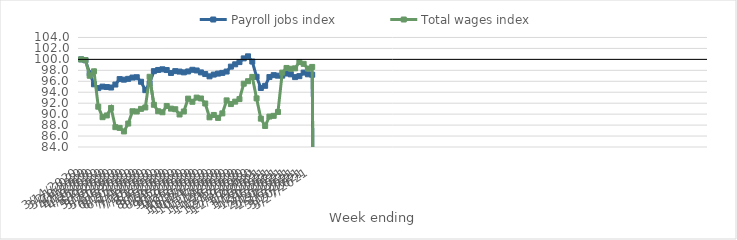
| Category | Payroll jobs index | Total wages index |
|---|---|---|
| 14/03/2020 | 100 | 100 |
| 21/03/2020 | 99.845 | 99.87 |
| 28/03/2020 | 97.45 | 97.012 |
| 04/04/2020 | 95.448 | 97.819 |
| 11/04/2020 | 94.757 | 91.361 |
| 18/04/2020 | 95.027 | 89.446 |
| 25/04/2020 | 94.95 | 89.761 |
| 02/05/2020 | 94.86 | 91.133 |
| 09/05/2020 | 95.405 | 87.621 |
| 16/05/2020 | 96.403 | 87.488 |
| 23/05/2020 | 96.296 | 86.84 |
| 30/05/2020 | 96.446 | 88.282 |
| 06/06/2020 | 96.68 | 90.528 |
| 13/06/2020 | 96.741 | 90.481 |
| 20/06/2020 | 95.914 | 90.964 |
| 27/06/2020 | 94.378 | 91.221 |
| 04/07/2020 | 95.625 | 96.821 |
| 11/07/2020 | 97.85 | 91.711 |
| 18/07/2020 | 98.067 | 90.529 |
| 25/07/2020 | 98.188 | 90.346 |
| 01/08/2020 | 98.05 | 91.493 |
| 08/08/2020 | 97.52 | 91.007 |
| 15/08/2020 | 97.854 | 90.897 |
| 22/08/2020 | 97.77 | 89.936 |
| 29/08/2020 | 97.63 | 90.484 |
| 05/09/2020 | 97.798 | 92.836 |
| 12/09/2020 | 98.101 | 92.263 |
| 19/09/2020 | 97.975 | 93.02 |
| 26/09/2020 | 97.623 | 92.862 |
| 03/10/2020 | 97.32 | 91.946 |
| 10/10/2020 | 96.904 | 89.418 |
| 17/10/2020 | 97.223 | 89.854 |
| 24/10/2020 | 97.403 | 89.311 |
| 31/10/2020 | 97.532 | 90.139 |
| 07/11/2020 | 97.779 | 92.513 |
| 14/11/2020 | 98.675 | 91.839 |
| 21/11/2020 | 99.098 | 92.285 |
| 28/11/2020 | 99.507 | 92.751 |
| 05/12/2020 | 100.182 | 95.56 |
| 12/12/2020 | 100.557 | 96.013 |
| 19/12/2020 | 99.604 | 96.805 |
| 26/12/2020 | 96.822 | 92.88 |
| 02/01/2021 | 94.78 | 89.176 |
| 09/01/2021 | 95.171 | 87.842 |
| 16/01/2021 | 96.777 | 89.56 |
| 23/01/2021 | 97.118 | 89.692 |
| 30/01/2021 | 97.025 | 90.397 |
| 06/02/2021 | 97.032 | 97.583 |
| 13/02/2021 | 97.417 | 98.435 |
| 20/02/2021 | 97.267 | 98.289 |
| 27/02/2021 | 96.762 | 98.364 |
| 06/03/2021 | 96.938 | 99.517 |
| 13/03/2021 | 97.59 | 99.182 |
| 20/03/2021 | 97.278 | 98.322 |
| 27/03/2021 | 97.197 | 98.621 |